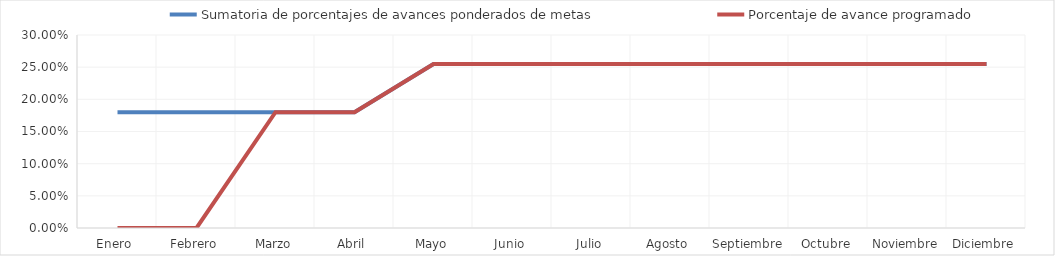
| Category | Sumatoria de porcentajes de avances ponderados de metas | Porcentaje de avance programado |
|---|---|---|
| Enero  | 0.18 | 0 |
| Febrero | 0.18 | 0 |
| Marzo | 0.18 | 0.18 |
| Abril | 0.18 | 0.18 |
| Mayo | 0.255 | 0.255 |
| Junio | 0.255 | 0.255 |
| Julio | 0.255 | 0.255 |
| Agosto | 0.255 | 0.255 |
| Septiembre | 0.255 | 0.255 |
| Octubre | 0.255 | 0.255 |
| Noviembre | 0.255 | 0.255 |
| Diciembre | 0.255 | 0.255 |